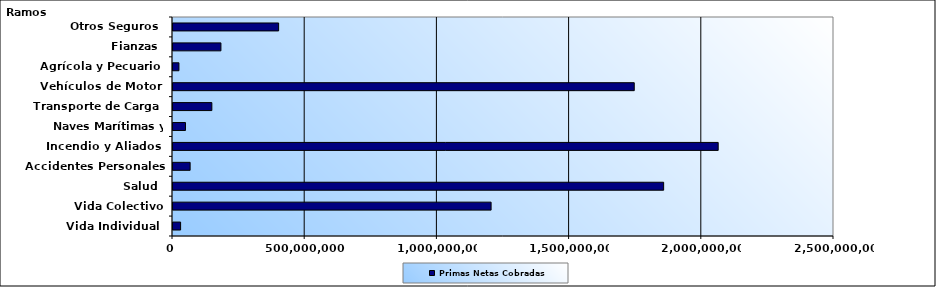
| Category | Primas Netas Cobradas |
|---|---|
| Vida Individual  | 28741023.01 |
| Vida Colectivo | 1203090339.32 |
| Salud  | 1855692901.59 |
| Accidentes Personales | 64776887.61 |
| Incendio y Aliados  | 2062022587.9 |
| Naves Marítimas y Aéreas  | 47162815.96 |
| Transporte de Carga  | 146946689.53 |
| Vehículos de Motor  | 1744544533.65 |
| Agrícola y Pecuario  | 22444431.26 |
| Fianzas  | 181251618.34 |
| Otros Seguros  | 399508932.96 |